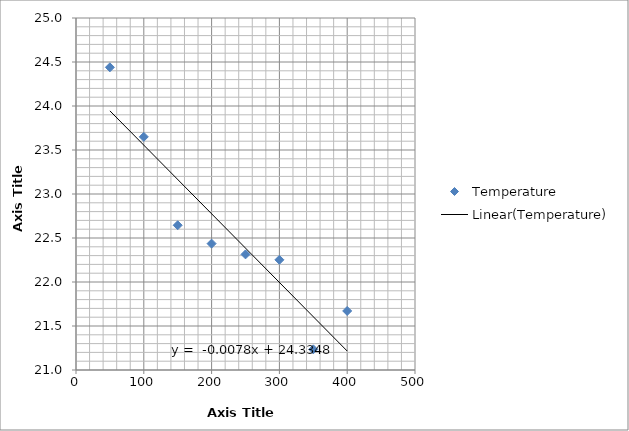
| Category | Temperature |
|---|---|
| 50.0 | 24.439 |
| 100.0 | 23.649 |
| 150.0 | 22.645 |
| 200.0 | 22.436 |
| 250.0 | 22.314 |
| 300.0 | 22.252 |
| 350.0 | 21.235 |
| 400.0 | 21.671 |